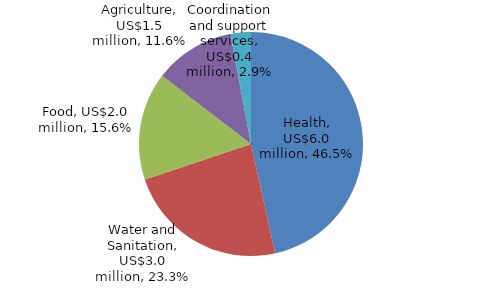
| Category | Series 0 |
|---|---|
| Health | 5.996 |
| Water and Sanitation | 3.005 |
| Food | 2.005 |
| Agriculture | 1.5 |
| Coordination and support services | 0.379 |